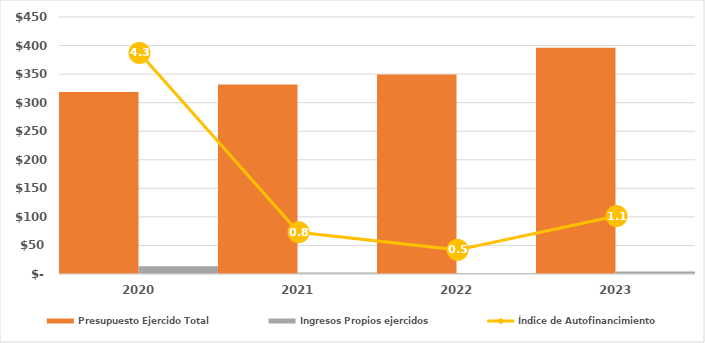
| Category | Presupuesto Ejercido Total | Ingresos Propios ejercidos |
|---|---|---|
| 2020.0 | 318785.247 | 13709.89 |
| 2021.0 | 331789.211 | 2693.74 |
| 2022.0 | 349320.095 | 1640.453 |
| 2023.0 | 396127.993 | 4463.337 |